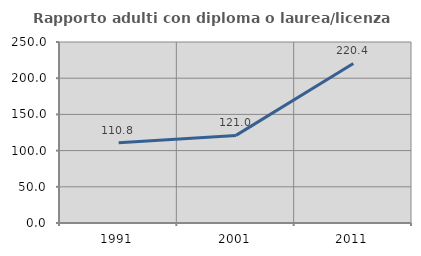
| Category | Rapporto adulti con diploma o laurea/licenza media  |
|---|---|
| 1991.0 | 110.843 |
| 2001.0 | 121.008 |
| 2011.0 | 220.37 |